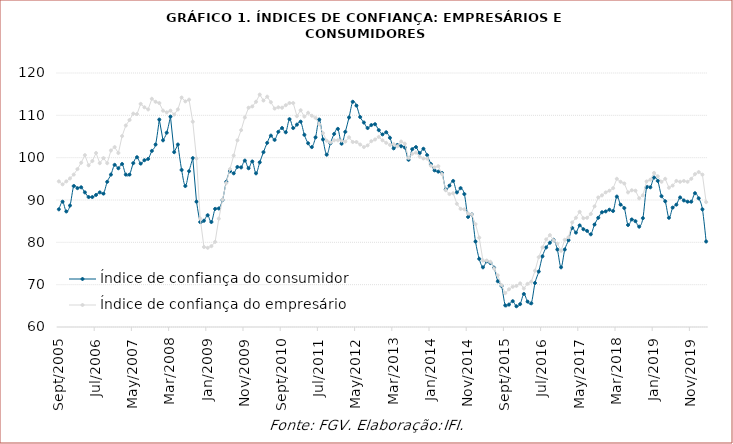
| Category | Índice de confiança do consumidor | Índice de confiança do empresário |
|---|---|---|
| 2005-09-01 | 87.8 | 94.4 |
| 2005-10-01 | 89.6 | 93.7 |
| 2005-11-01 | 87.3 | 94.4 |
| 2005-12-01 | 88.7 | 95.1 |
| 2006-01-01 | 93.3 | 96 |
| 2006-02-01 | 92.8 | 97.3 |
| 2006-03-01 | 93 | 98.8 |
| 2006-04-01 | 91.8 | 100.6 |
| 2006-05-01 | 90.7 | 98.2 |
| 2006-06-01 | 90.7 | 99.2 |
| 2006-07-01 | 91.2 | 101.1 |
| 2006-08-01 | 91.8 | 98.7 |
| 2006-09-01 | 91.5 | 99.9 |
| 2006-10-01 | 94.3 | 98.7 |
| 2006-11-01 | 96 | 101.7 |
| 2006-12-01 | 98.3 | 102.5 |
| 2007-01-01 | 97.5 | 101.1 |
| 2007-02-01 | 98.5 | 105.1 |
| 2007-03-01 | 96 | 107.6 |
| 2007-04-01 | 96 | 108.9 |
| 2007-05-01 | 98.7 | 110.4 |
| 2007-06-01 | 100.1 | 110.3 |
| 2007-07-01 | 98.6 | 112.7 |
| 2007-08-01 | 99.4 | 111.9 |
| 2007-09-01 | 99.7 | 111.4 |
| 2007-10-01 | 101.6 | 113.9 |
| 2007-11-01 | 103.1 | 113.2 |
| 2007-12-01 | 109 | 112.9 |
| 2008-01-01 | 104.1 | 111.1 |
| 2008-02-01 | 105.9 | 110.7 |
| 2008-03-01 | 109.7 | 111.1 |
| 2008-04-01 | 101.3 | 110.2 |
| 2008-05-01 | 103.1 | 111.4 |
| 2008-06-01 | 97.1 | 114.2 |
| 2008-07-01 | 93.3 | 113.3 |
| 2008-08-01 | 96.8 | 113.7 |
| 2008-09-01 | 99.9 | 108.5 |
| 2008-10-01 | 89.6 | 99.8 |
| 2008-11-01 | 84.8 | 85.6 |
| 2008-12-01 | 85.1 | 78.9 |
| 2009-01-01 | 86.4 | 78.7 |
| 2009-02-01 | 84.8 | 79.1 |
| 2009-03-01 | 87.9 | 80.1 |
| 2009-04-01 | 88 | 85.6 |
| 2009-05-01 | 90 | 90.1 |
| 2009-06-01 | 94.3 | 94 |
| 2009-07-01 | 96.8 | 97.3 |
| 2009-08-01 | 96.3 | 100.5 |
| 2009-09-01 | 97.8 | 104.1 |
| 2009-10-01 | 97.7 | 106.5 |
| 2009-11-01 | 99.3 | 109.5 |
| 2009-12-01 | 97.5 | 111.8 |
| 2010-01-01 | 99.1 | 112.1 |
| 2010-02-01 | 96.3 | 113.2 |
| 2010-03-01 | 98.9 | 114.9 |
| 2010-04-01 | 101.3 | 113.5 |
| 2010-05-01 | 103.5 | 114.4 |
| 2010-06-01 | 105.2 | 113.1 |
| 2010-07-01 | 104.2 | 111.6 |
| 2010-08-01 | 106.1 | 111.9 |
| 2010-09-01 | 107 | 111.8 |
| 2010-10-01 | 106 | 112.4 |
| 2010-11-01 | 109.1 | 112.9 |
| 2010-12-01 | 107 | 112.9 |
| 2011-01-01 | 107.8 | 109.8 |
| 2011-02-01 | 108.5 | 111.2 |
| 2011-03-01 | 105.4 | 109.7 |
| 2011-04-01 | 103.4 | 110.6 |
| 2011-05-01 | 102.5 | 109.9 |
| 2011-06-01 | 104.8 | 109.4 |
| 2011-07-01 | 109 | 107.9 |
| 2011-08-01 | 104.3 | 105.8 |
| 2011-09-01 | 100.7 | 104 |
| 2011-10-01 | 103.4 | 103.6 |
| 2011-11-01 | 105.6 | 104.1 |
| 2011-12-01 | 106.8 | 104.1 |
| 2012-01-01 | 103.3 | 104 |
| 2012-02-01 | 106.1 | 103.8 |
| 2012-03-01 | 109.5 | 104.8 |
| 2012-04-01 | 113.2 | 103.7 |
| 2012-05-01 | 112.3 | 103.7 |
| 2012-06-01 | 109.6 | 103.1 |
| 2012-07-01 | 108.3 | 102.5 |
| 2012-08-01 | 107 | 102.9 |
| 2012-09-01 | 107.7 | 103.9 |
| 2012-10-01 | 107.9 | 104.3 |
| 2012-11-01 | 106.5 | 104.9 |
| 2012-12-01 | 105.5 | 104.1 |
| 2013-01-01 | 106 | 103.5 |
| 2013-02-01 | 104.7 | 103 |
| 2013-03-01 | 102.2 | 103.2 |
| 2013-04-01 | 103 | 102.7 |
| 2013-05-01 | 102.7 | 103.8 |
| 2013-06-01 | 102.4 | 103.3 |
| 2013-07-01 | 99.5 | 99.9 |
| 2013-08-01 | 102 | 100.9 |
| 2013-09-01 | 102.5 | 101.2 |
| 2013-10-01 | 101.1 | 100.2 |
| 2013-11-01 | 102.1 | 99.8 |
| 2013-12-01 | 100.6 | 99.8 |
| 2014-01-01 | 98.5 | 98.1 |
| 2014-02-01 | 97 | 97.7 |
| 2014-03-01 | 96.7 | 98 |
| 2014-04-01 | 96.4 | 96.1 |
| 2014-05-01 | 92.5 | 92.3 |
| 2014-06-01 | 93.4 | 91.4 |
| 2014-07-01 | 94.5 | 91.6 |
| 2014-08-01 | 91.8 | 89.1 |
| 2014-09-01 | 92.8 | 87.9 |
| 2014-10-01 | 91.4 | 87.8 |
| 2014-11-01 | 86 | 86.8 |
| 2014-12-01 | 86.6 | 86.6 |
| 2015-01-01 | 80.2 | 84.3 |
| 2015-02-01 | 76.1 | 81.1 |
| 2015-03-01 | 74.1 | 75.7 |
| 2015-04-01 | 75.5 | 75.7 |
| 2015-05-01 | 75.1 | 75.4 |
| 2015-06-01 | 74 | 73.8 |
| 2015-07-01 | 70.8 | 72.2 |
| 2015-08-01 | 69.7 | 69.9 |
| 2015-09-01 | 65.1 | 68 |
| 2015-10-01 | 65.3 | 68.9 |
| 2015-11-01 | 66.1 | 69.5 |
| 2015-12-01 | 64.9 | 69.7 |
| 2016-01-01 | 65.4 | 70.3 |
| 2016-02-01 | 67.8 | 69.1 |
| 2016-03-01 | 66 | 70.2 |
| 2016-04-01 | 65.6 | 70.7 |
| 2016-05-01 | 70.4 | 73.3 |
| 2016-06-01 | 73.1 | 76.5 |
| 2016-07-01 | 76.7 | 78.8 |
| 2016-08-01 | 78.8 | 80.7 |
| 2016-09-01 | 79.9 | 81.7 |
| 2016-10-01 | 80.6 | 80.5 |
| 2016-11-01 | 78.3 | 79.7 |
| 2016-12-01 | 74.1 | 78 |
| 2017-01-01 | 78.3 | 80.6 |
| 2017-02-01 | 80.5 | 81.2 |
| 2017-03-01 | 83.4 | 84.7 |
| 2017-04-01 | 82.3 | 85.8 |
| 2017-05-01 | 84 | 87.2 |
| 2017-06-01 | 83.1 | 85.7 |
| 2017-07-01 | 82.7 | 85.8 |
| 2017-08-01 | 81.9 | 86.7 |
| 2017-09-01 | 84.2 | 88.5 |
| 2017-10-01 | 85.8 | 90.6 |
| 2017-11-01 | 87.1 | 91.1 |
| 2017-12-01 | 87.3 | 91.8 |
| 2018-01-01 | 87.7 | 92.2 |
| 2018-02-01 | 87.4 | 92.8 |
| 2018-03-01 | 90.8 | 95 |
| 2018-04-01 | 88.9 | 94.3 |
| 2018-05-01 | 88.1 | 93.9 |
| 2018-06-01 | 84.1 | 91.8 |
| 2018-07-01 | 85.4 | 92.3 |
| 2018-08-01 | 85 | 92.2 |
| 2018-09-01 | 83.7 | 90.4 |
| 2018-10-01 | 85.7 | 91.1 |
| 2018-11-01 | 93 | 94.4 |
| 2018-12-01 | 93 | 94.8 |
| 2019-01-01 | 95.3 | 96.4 |
| 2019-02-01 | 94.5 | 95.6 |
| 2019-03-01 | 90.9 | 94.3 |
| 2019-04-01 | 89.7 | 95 |
| 2019-05-01 | 85.8 | 92.9 |
| 2019-06-01 | 88.2 | 93.4 |
| 2019-07-01 | 88.9 | 94.5 |
| 2019-08-01 | 90.6 | 94.3 |
| 2019-09-01 | 89.9 | 94.5 |
| 2019-10-01 | 89.6 | 94.3 |
| 2019-11-01 | 89.6 | 95 |
| 2019-12-01 | 91.6 | 96.1 |
| 2020-01-01 | 90.4 | 96.6 |
| 2020-02-01 | 87.8 | 96 |
| 2020-03-01 | 80.2 | 89.5 |